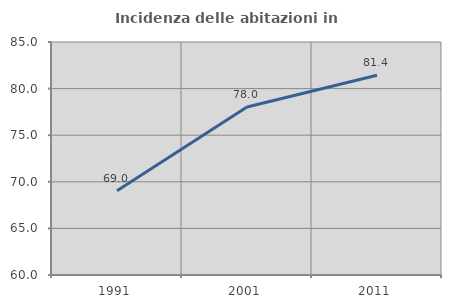
| Category | Incidenza delle abitazioni in proprietà  |
|---|---|
| 1991.0 | 69.049 |
| 2001.0 | 78.029 |
| 2011.0 | 81.426 |